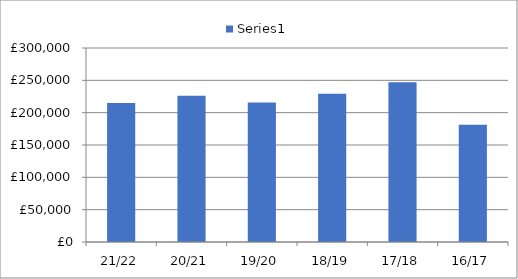
| Category | Series 0 |
|---|---|
| 21/22 | 215000 |
| 20/21 | 226290 |
| 19/20 | 215875 |
| 18/19 | 229315 |
| 17/18 | 247097 |
| 16/17 | 181175 |